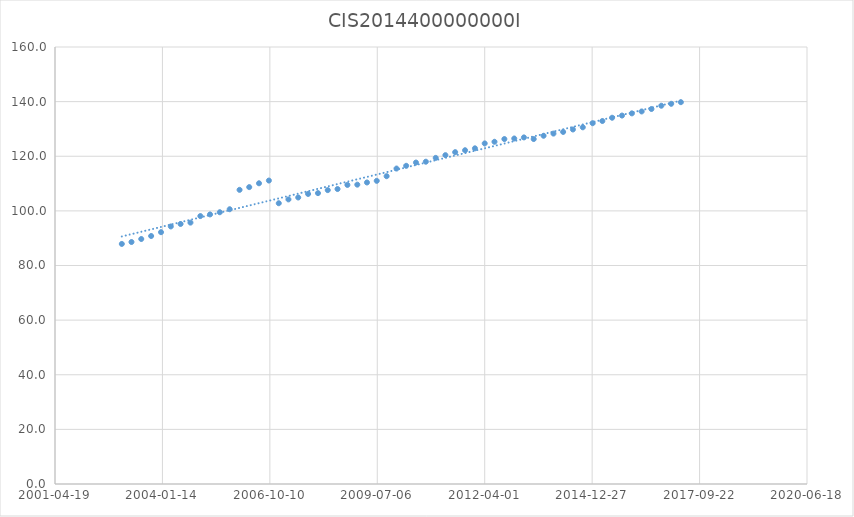
| Category | CIS2014400000000I |
|---|---|
| 37622.0 | 87.9 |
| 37712.0 | 88.6 |
| 37803.0 | 89.7 |
| 37895.0 | 90.8 |
| 37987.0 | 92.2 |
| 38078.0 | 94.3 |
| 38169.0 | 95.2 |
| 38261.0 | 95.7 |
| 38353.0 | 98.1 |
| 38443.0 | 98.7 |
| 38534.0 | 99.5 |
| 38626.0 | 100.6 |
| 38718.0 | 107.7 |
| 38808.0 | 108.7 |
| 38899.0 | 110.1 |
| 38991.0 | 111.1 |
| 39083.0 | 102.8 |
| 39173.0 | 104.2 |
| 39264.0 | 104.9 |
| 39356.0 | 106.2 |
| 39448.0 | 106.5 |
| 39539.0 | 107.6 |
| 39630.0 | 108 |
| 39722.0 | 109.5 |
| 39814.0 | 109.6 |
| 39904.0 | 110.4 |
| 39995.0 | 111 |
| 40087.0 | 112.7 |
| 40179.0 | 115.5 |
| 40269.0 | 116.5 |
| 40360.0 | 117.7 |
| 40452.0 | 118 |
| 40544.0 | 119.4 |
| 40634.0 | 120.4 |
| 40725.0 | 121.5 |
| 40817.0 | 122.2 |
| 40909.0 | 122.9 |
| 41000.0 | 124.7 |
| 41091.0 | 125.3 |
| 41183.0 | 126.3 |
| 41275.0 | 126.5 |
| 41365.0 | 126.9 |
| 41456.0 | 126.3 |
| 41548.0 | 127.5 |
| 41640.0 | 128.3 |
| 41730.0 | 128.9 |
| 41821.0 | 129.8 |
| 41913.0 | 130.6 |
| 42005.0 | 132.1 |
| 42095.0 | 132.9 |
| 42186.0 | 134.1 |
| 42278.0 | 134.9 |
| 42370.0 | 135.7 |
| 42461.0 | 136.4 |
| 42552.0 | 137.3 |
| 42644.0 | 138.5 |
| 42736.0 | 139.2 |
| 42826.0 | 139.8 |